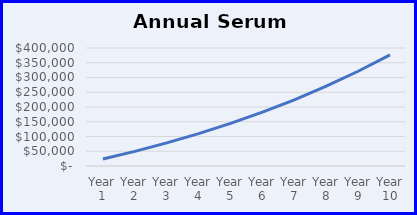
| Category | Series 0 |
|---|---|
| Year 1 | 23645.313 |
| Year 2 | 49655.156 |
| Year 3 | 78265.984 |
| Year 4 | 109737.895 |
| Year 5 | 144356.997 |
| Year 6 | 182438.01 |
| Year 7 | 224327.123 |
| Year 8 | 270405.148 |
| Year 9 | 321090.975 |
| Year 10 | 376845.385 |